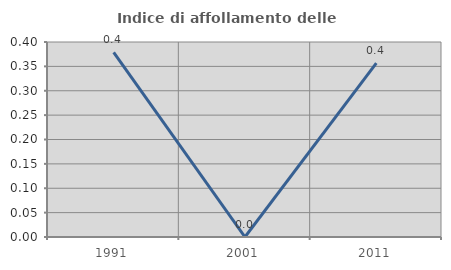
| Category | Indice di affollamento delle abitazioni  |
|---|---|
| 1991.0 | 0.379 |
| 2001.0 | 0 |
| 2011.0 | 0.357 |